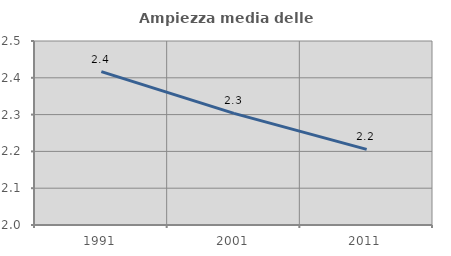
| Category | Ampiezza media delle famiglie |
|---|---|
| 1991.0 | 2.417 |
| 2001.0 | 2.303 |
| 2011.0 | 2.205 |